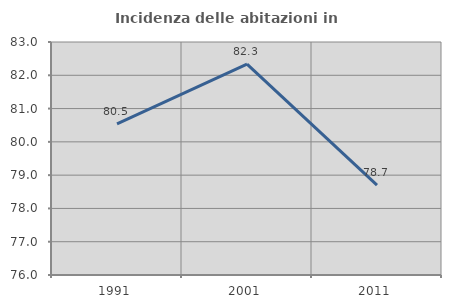
| Category | Incidenza delle abitazioni in proprietà  |
|---|---|
| 1991.0 | 80.541 |
| 2001.0 | 82.334 |
| 2011.0 | 78.701 |